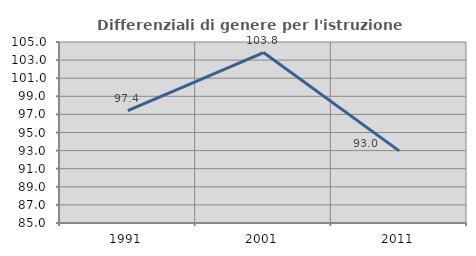
| Category | Differenziali di genere per l'istruzione superiore |
|---|---|
| 1991.0 | 97.411 |
| 2001.0 | 103.837 |
| 2011.0 | 92.97 |